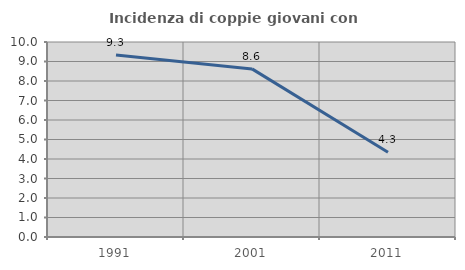
| Category | Incidenza di coppie giovani con figli |
|---|---|
| 1991.0 | 9.333 |
| 2001.0 | 8.621 |
| 2011.0 | 4.348 |